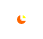
| Category | Central Med. |
|---|---|
| 0 | 1398 |
| 1 | 0 |
| 2 | 4160 |